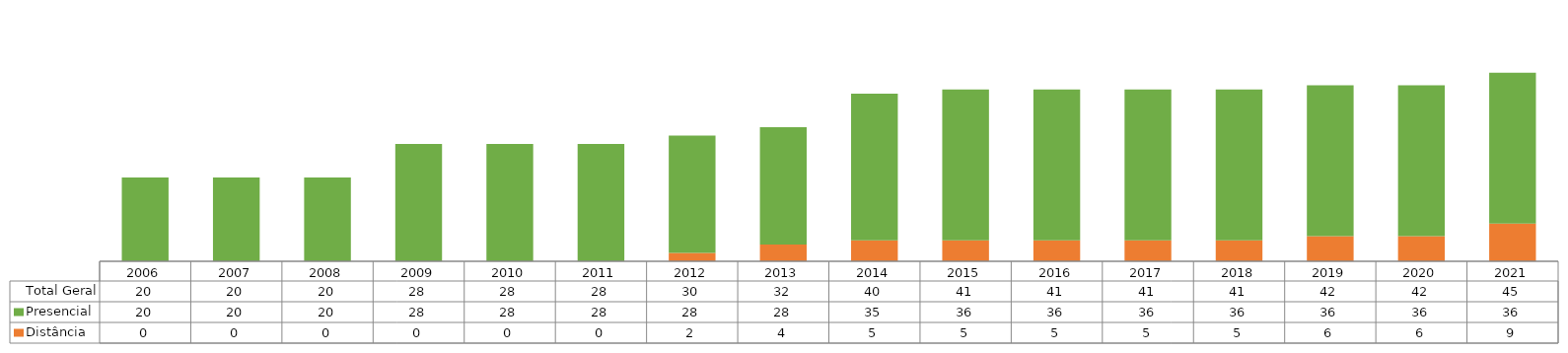
| Category | Distância | Presencial | Total Geral |
|---|---|---|---|
| 2006.0 | 0 | 20 | 20 |
| 2007.0 | 0 | 20 | 20 |
| 2008.0 | 0 | 20 | 20 |
| 2009.0 | 0 | 28 | 28 |
| 2010.0 | 0 | 28 | 28 |
| 2011.0 | 0 | 28 | 28 |
| 2012.0 | 2 | 28 | 30 |
| 2013.0 | 4 | 28 | 32 |
| 2014.0 | 5 | 35 | 40 |
| 2015.0 | 5 | 36 | 41 |
| 2016.0 | 5 | 36 | 41 |
| 2017.0 | 5 | 36 | 41 |
| 2018.0 | 5 | 36 | 41 |
| 2019.0 | 6 | 36 | 42 |
| 2020.0 | 6 | 36 | 42 |
| 2021.0 | 9 | 36 | 45 |